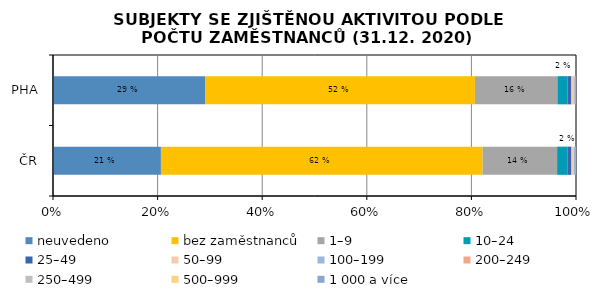
| Category | neuvedeno | bez zaměstnanců | 1–9 | 10–24 | 25–49 | 50–99 | 100–199 | 200–249 | 250–499 | 500–999 | 1 000 a více |
|---|---|---|---|---|---|---|---|---|---|---|---|
| ČR | 20.635 | 61.5 | 14.255 | 1.962 | 0.78 | 0.469 | 0.213 | 0.039 | 0.082 | 0.038 | 0.027 |
| PHA | 29.143 | 51.531 | 15.777 | 1.959 | 0.714 | 0.427 | 0.225 | 0.042 | 0.091 | 0.046 | 0.044 |